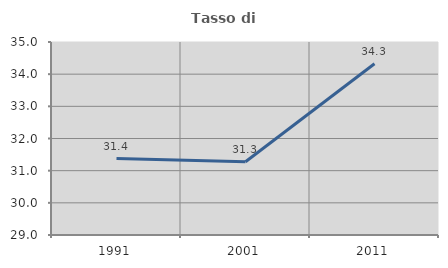
| Category | Tasso di occupazione   |
|---|---|
| 1991.0 | 31.376 |
| 2001.0 | 31.279 |
| 2011.0 | 34.323 |